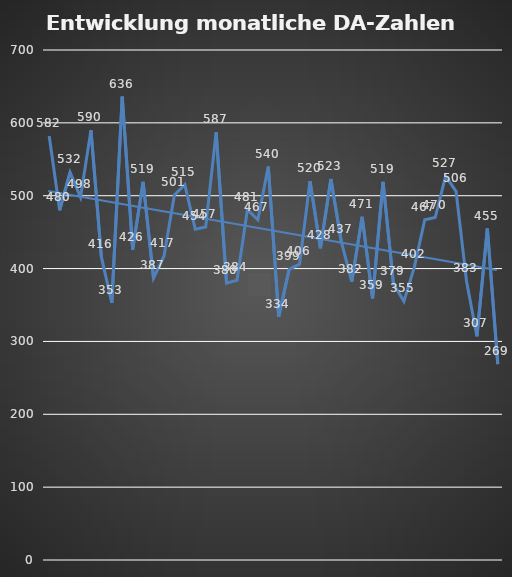
| Category | Series 0 |
|---|---|
| Jan. | 582 |
| Feb. | 480 |
| März | 532 |
| April | 498 |
| Mai | 590 |
| Juni | 416 |
| Juli | 353 |
| August | 636 |
| Sept. | 426 |
| Okt. | 519 |
| Nov. | 387 |
| Dez. | 417 |
| Jan. | 501 |
| Feb. | 515 |
| März | 454 |
| April | 457 |
| Mai | 587 |
| Juni | 380 |
| Juli | 384 |
| Aug. | 481 |
| Sept. | 467 |
| Okt. | 540 |
| Nov. | 334 |
| Dez. | 399 |
| Jan. | 406 |
| Feb. | 520 |
| März | 428 |
| April | 523 |
| Mai | 437 |
| Juni | 382 |
| Juli | 471 |
| Aug. | 359 |
| Sept. | 519 |
| Okt. | 379 |
| Nov. | 355 |
| Dez. | 402 |
| Jan. | 467 |
| Feb. | 470 |
| März | 527 |
| April | 506 |
| Mai | 383 |
| Juni | 307 |
| Juli | 455 |
| Aug. | 269 |